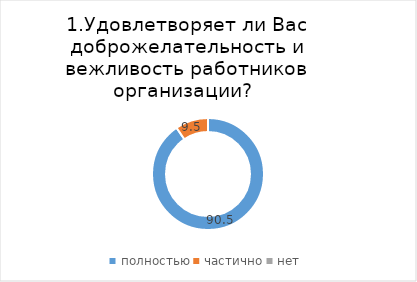
| Category | Верхнекетский |
|---|---|
| полностью | 90.494 |
| частично | 9.506 |
| нет | 0 |